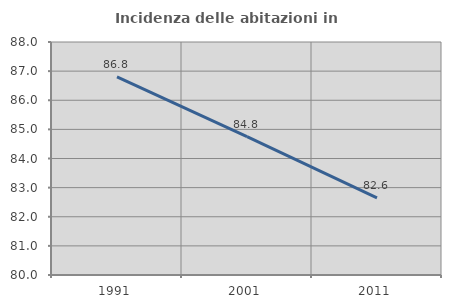
| Category | Incidenza delle abitazioni in proprietà  |
|---|---|
| 1991.0 | 86.805 |
| 2001.0 | 84.75 |
| 2011.0 | 82.647 |